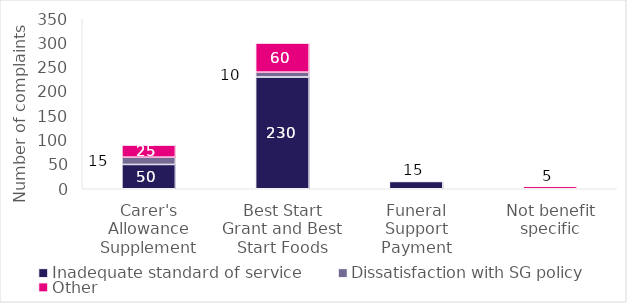
| Category | Inadequate standard of service | Dissatisfaction with SG policy | Other |
|---|---|---|---|
| Carer's Allowance Supplement | 50 | 15 | 25 |
| Best Start Grant and Best Start Foods | 230 | 10 | 60 |
| Funeral Support Payment | 15 | 0 | 0 |
| Not benefit specific | 0 | 0 | 5 |